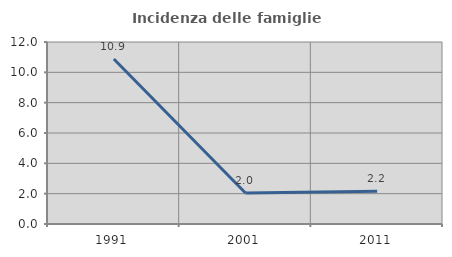
| Category | Incidenza delle famiglie numerose |
|---|---|
| 1991.0 | 10.882 |
| 2001.0 | 2.041 |
| 2011.0 | 2.152 |